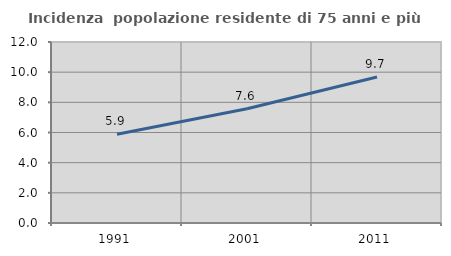
| Category | Incidenza  popolazione residente di 75 anni e più |
|---|---|
| 1991.0 | 5.882 |
| 2001.0 | 7.575 |
| 2011.0 | 9.676 |